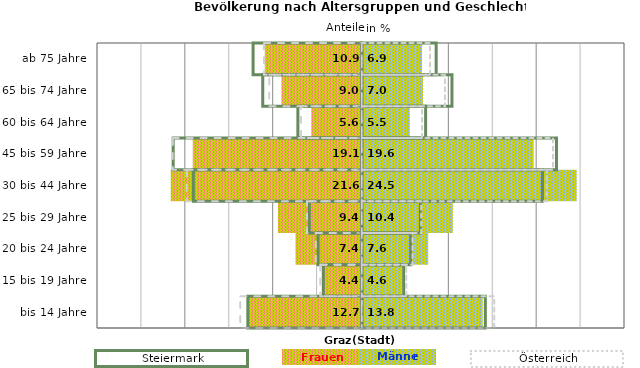
| Category | Frauen | Männer | Frauen Spalte2 | Männer Spalte2 | Frauen Spalte3 | Männer Spalte3 |
|---|---|---|---|---|---|---|
| bis 14 Jahre | -12.7 | 13.8 | 14.1 | -13 | -13.8 | 15.1 |
| 15 bis 19 Jahre | -4.4 | 4.6 | 4.8 | -4.4 | -4.7 | 5.1 |
| 20 bis 24 Jahre | -7.4 | 7.6 | 5.6 | -5 | -5.2 | 5.8 |
| 25 bis 29 Jahre | -9.4 | 10.4 | 6.7 | -6 | -6.2 | 6.8 |
| 30 bis 44 Jahre | -21.6 | 24.5 | 20.6 | -19.2 | -19.9 | 21.1 |
| 45 bis 59 Jahre | -19.1 | 19.6 | 22.2 | -21.5 | -21.5 | 21.8 |
| 60 bis 64 Jahre | -5.6 | 5.5 | 7.3 | -7.3 | -6.9 | 6.9 |
| 65 bis 74 Jahre | -9 | 7 | 10.3 | -11.3 | -10.5 | 9.5 |
| ab 75 Jahre | -10.9 | 6.9 | 8.5 | -12.4 | -11.1 | 7.8 |